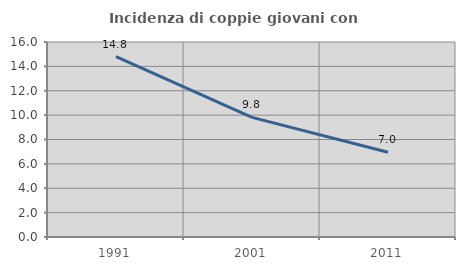
| Category | Incidenza di coppie giovani con figli |
|---|---|
| 1991.0 | 14.804 |
| 2001.0 | 9.815 |
| 2011.0 | 6.956 |